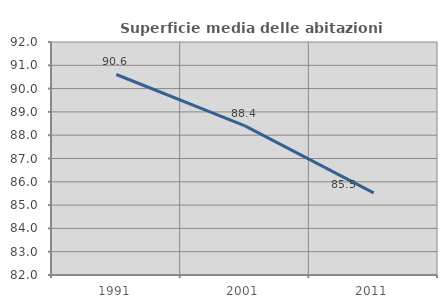
| Category | Superficie media delle abitazioni occupate |
|---|---|
| 1991.0 | 90.605 |
| 2001.0 | 88.4 |
| 2011.0 | 85.525 |